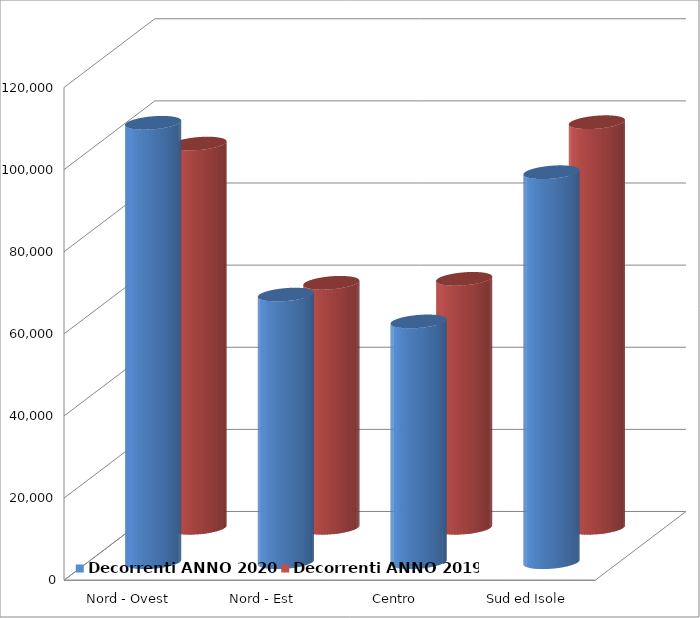
| Category | Decorrenti ANNO 2020 | Decorrenti ANNO 2019 |
|---|---|---|
| Nord - Ovest | 107009 | 93574 |
| Nord - Est | 65169 | 59670 |
| Centro | 58635 | 60638 |
| Sud ed Isole | 94971 | 98783 |